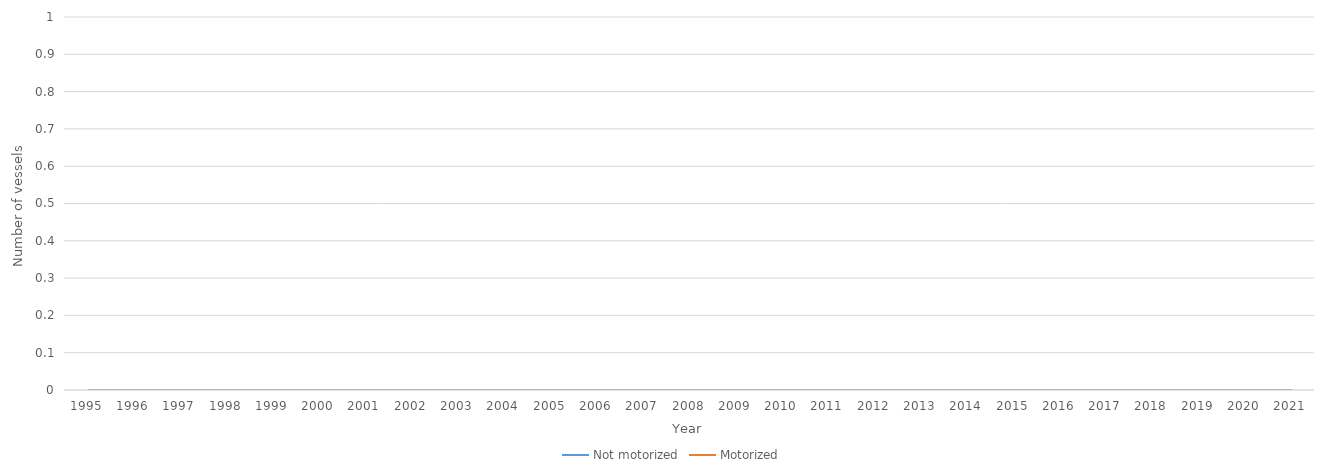
| Category | Not motorized | Motorized |
|---|---|---|
| 1995.0 | 0 | 0 |
| 1996.0 | 0 | 0 |
| 1997.0 | 0 | 0 |
| 1998.0 | 0 | 0 |
| 1999.0 | 0 | 0 |
| 2000.0 | 0 | 0 |
| 2001.0 | 0 | 0 |
| 2002.0 | 0 | 0 |
| 2003.0 | 0 | 0 |
| 2004.0 | 0 | 0 |
| 2005.0 | 0 | 0 |
| 2006.0 | 0 | 0 |
| 2007.0 | 0 | 0 |
| 2008.0 | 0 | 0 |
| 2009.0 | 0 | 0 |
| 2010.0 | 0 | 0 |
| 2011.0 | 0 | 0 |
| 2012.0 | 0 | 0 |
| 2013.0 | 0 | 0 |
| 2014.0 | 0 | 0 |
| 2015.0 | 0 | 0 |
| 2016.0 | 0 | 0 |
| 2017.0 | 0 | 0 |
| 2018.0 | 0 | 0 |
| 2019.0 | 0 | 0 |
| 2020.0 | 0 | 0 |
| 2021.0 | 0 | 0 |